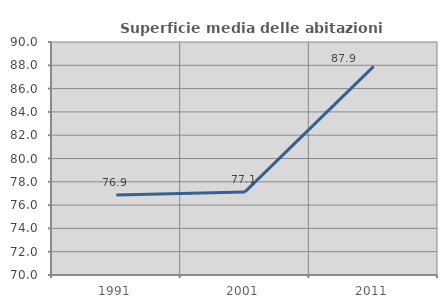
| Category | Superficie media delle abitazioni occupate |
|---|---|
| 1991.0 | 76.875 |
| 2001.0 | 77.132 |
| 2011.0 | 87.914 |